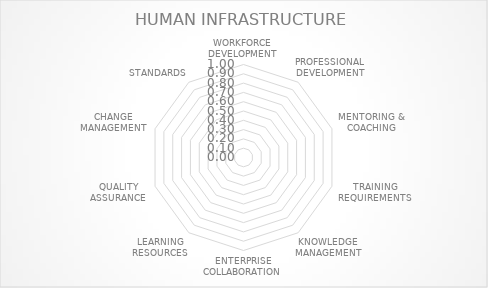
| Category | Series 0 |
|---|---|
| WORKFORCE DEVELOPMENT | 0 |
| PROFESSIONAL DEVELOPMENT | 0 |
| MENTORING & COACHING | 0 |
| TRAINING REQUIREMENTS | 0 |
| KNOWLEDGE MANAGEMENT | 0 |
| ENTERPRISE COLLABORATION | 0 |
| LEARNING RESOURCES | 0 |
| QUALITY ASSURANCE | 0 |
| CHANGE MANAGEMENT | 0 |
| STANDARDS | 0 |